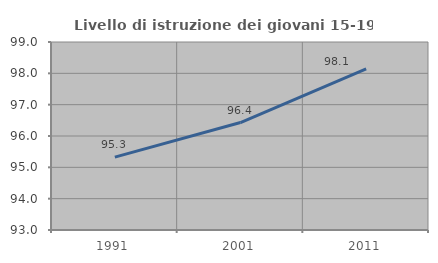
| Category | Livello di istruzione dei giovani 15-19 anni |
|---|---|
| 1991.0 | 95.326 |
| 2001.0 | 96.43 |
| 2011.0 | 98.142 |